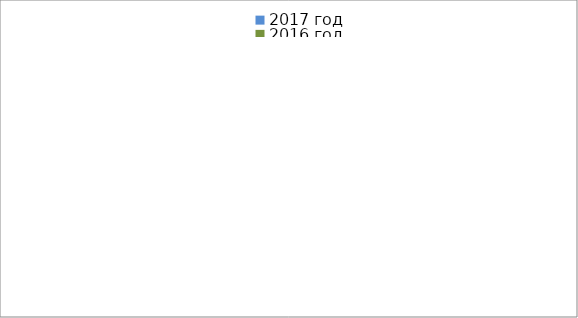
| Category | 2017 год | 2016 год |
|---|---|---|
|  - поджог | 3 | 24 |
|  - неосторожное обращение с огнём | 3 | 17 |
|  - НПТЭ электрооборудования | 10 | 6 |
|  - НПУ и Э печей | 25 | 21 |
|  - НПУ и Э транспортных средств | 33 | 12 |
|   -Шалость с огнем детей | 4 | 5 |
|  -НППБ при эксплуатации эл.приборов | 18 | 5 |
|  - курение | 20 | 7 |
| - прочие | 35 | 44 |
| - не установленные причины | 0 | 11 |